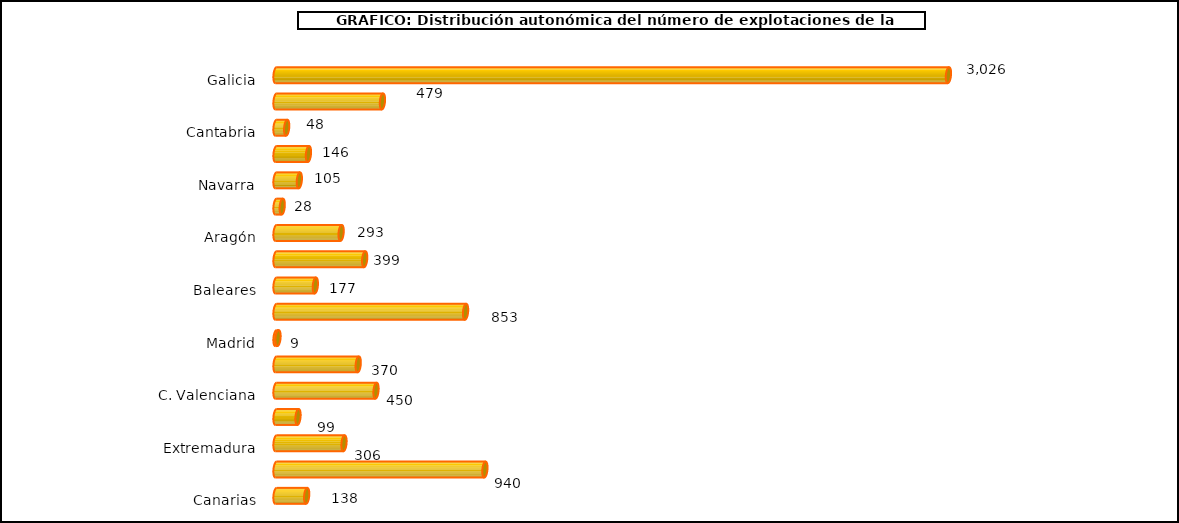
| Category | num. Explotaciones |
|---|---|
|   Galicia | 3026 |
|   P. de Asturias | 479 |
|   Cantabria | 48 |
|   País Vasco | 146 |
|   Navarra | 105 |
|   La Rioja | 28 |
|   Aragón | 293 |
|   Cataluña | 399 |
|   Baleares | 177 |
|   Castilla y León | 853 |
|   Madrid | 9 |
|   Castilla – La Mancha | 370 |
|   C. Valenciana | 450 |
|   R. de Murcia | 99 |
|   Extremadura | 306 |
|   Andalucía | 940 |
|   Canarias | 138 |